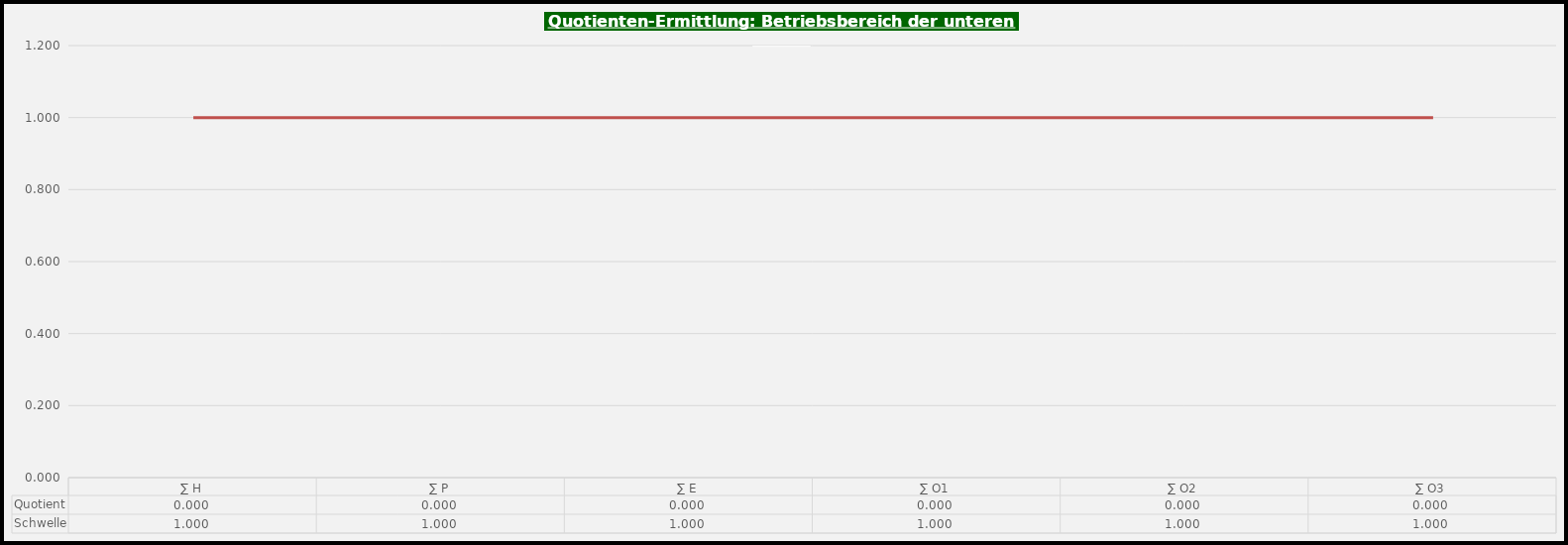
| Category | Quotient |
|---|---|
| ∑ H | 0 |
| ∑ P | 0 |
| ∑ E | 0 |
| ∑ O1 | 0 |
| ∑ O2 | 0 |
| ∑ O3 | 0 |